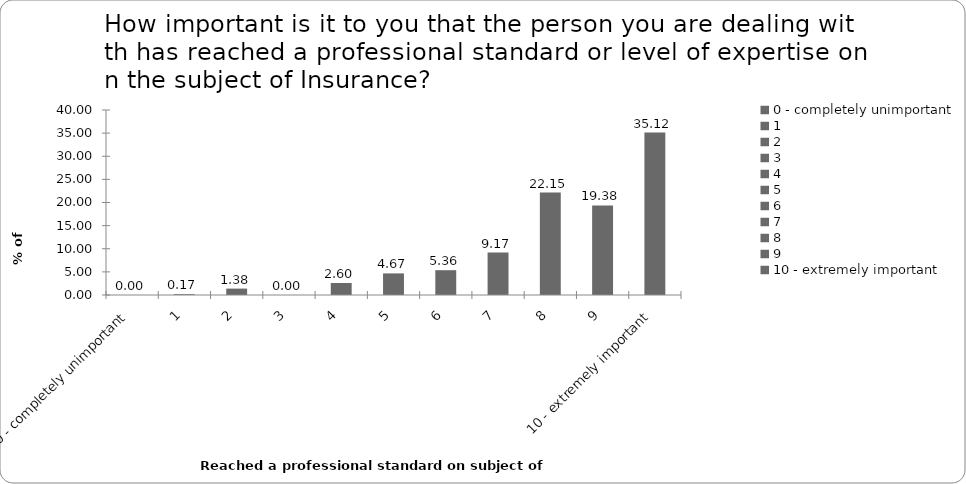
| Category | % of Respondents |
|---|---|
| 0 - completely unimportant | 0 |
| 1 | 0.173 |
| 2 | 1.384 |
| 3 | 0 |
| 4 | 2.595 |
| 5 | 4.671 |
| 6 | 5.363 |
| 7 | 9.17 |
| 8 | 22.145 |
| 9 | 19.377 |
| 10 - extremely important | 35.121 |